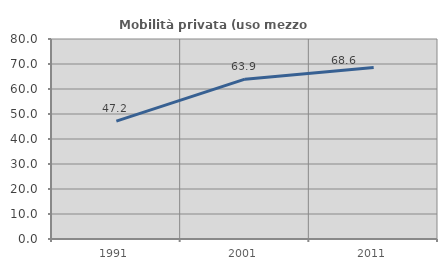
| Category | Mobilità privata (uso mezzo privato) |
|---|---|
| 1991.0 | 47.158 |
| 2001.0 | 63.929 |
| 2011.0 | 68.562 |